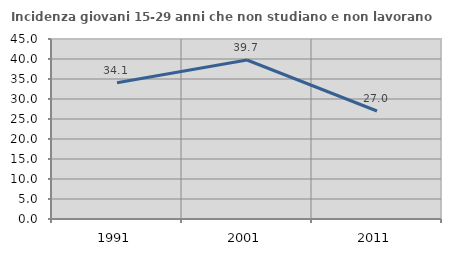
| Category | Incidenza giovani 15-29 anni che non studiano e non lavorano  |
|---|---|
| 1991.0 | 34.082 |
| 2001.0 | 39.749 |
| 2011.0 | 27.001 |